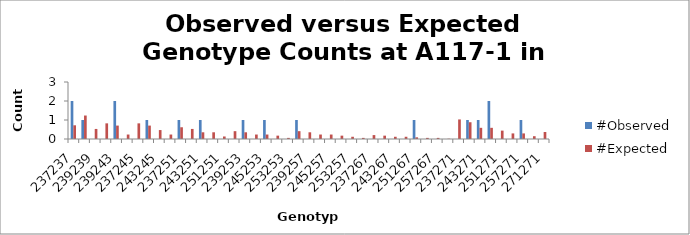
| Category | #Observed | #Expected |
|---|---|---|
| 237237.0 | 2 | 0.721 |
| 237239.0 | 1 | 1.235 |
| 239239.0 | 0 | 0.529 |
| 237243.0 | 0 | 0.824 |
| 239243.0 | 2 | 0.706 |
| 243243.0 | 0 | 0.235 |
| 237245.0 | 0 | 0.824 |
| 239245.0 | 1 | 0.706 |
| 243245.0 | 0 | 0.471 |
| 245245.0 | 0 | 0.235 |
| 237251.0 | 1 | 0.618 |
| 239251.0 | 0 | 0.529 |
| 243251.0 | 1 | 0.353 |
| 245251.0 | 0 | 0.353 |
| 251251.0 | 0 | 0.132 |
| 237253.0 | 0 | 0.412 |
| 239253.0 | 1 | 0.353 |
| 243253.0 | 0 | 0.235 |
| 245253.0 | 1 | 0.235 |
| 251253.0 | 0 | 0.176 |
| 253253.0 | 0 | 0.059 |
| 237257.0 | 1 | 0.412 |
| 239257.0 | 0 | 0.353 |
| 243257.0 | 0 | 0.235 |
| 245257.0 | 0 | 0.235 |
| 251257.0 | 0 | 0.176 |
| 253257.0 | 0 | 0.118 |
| 257257.0 | 0 | 0.059 |
| 237267.0 | 0 | 0.206 |
| 239267.0 | 0 | 0.176 |
| 243267.0 | 0 | 0.118 |
| 245267.0 | 0 | 0.118 |
| 251267.0 | 1 | 0.088 |
| 253267.0 | 0 | 0.059 |
| 257267.0 | 0 | 0.059 |
| 267267.0 | 0 | 0.015 |
| 237271.0 | 0 | 1.029 |
| 239271.0 | 1 | 0.882 |
| 243271.0 | 1 | 0.588 |
| 245271.0 | 2 | 0.588 |
| 251271.0 | 0 | 0.441 |
| 253271.0 | 0 | 0.294 |
| 257271.0 | 1 | 0.294 |
| 267271.0 | 0 | 0.147 |
| 271271.0 | 0 | 0.368 |